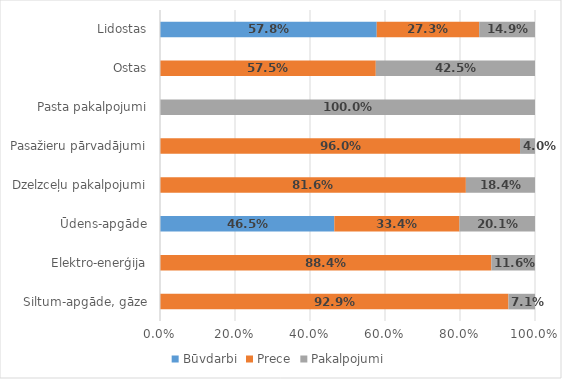
| Category | Būvdarbi | Prece | Pakalpojumi |
|---|---|---|---|
| Siltum-apgāde, gāze | 0 | 0.929 | 0.071 |
| Elektro-enerģija | 0 | 0.884 | 0.116 |
| Ūdens-apgāde | 0.465 | 0.334 | 0.201 |
| Dzelzceļu pakalpojumi | 0 | 0.816 | 0.184 |
| Pasažieru pārvadājumi | 0 | 0.96 | 0.04 |
| Pasta pakalpojumi | 0 | 0 | 1 |
| Ostas | 0 | 0.575 | 0.425 |
| Lidostas | 0.578 | 0.273 | 0.149 |